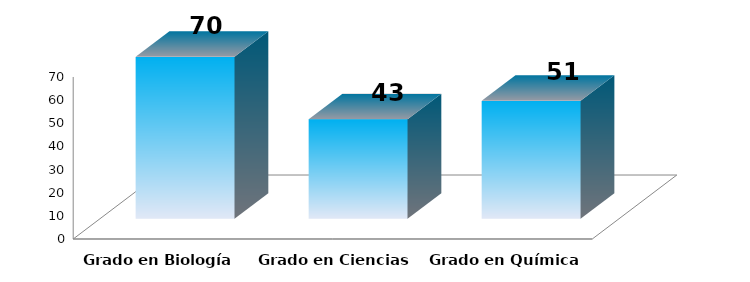
| Category | Series 0 |
|---|---|
| Grado en Biología | 70 |
| Grado en Ciencias Ambientales | 43 |
| Grado en Química | 51 |